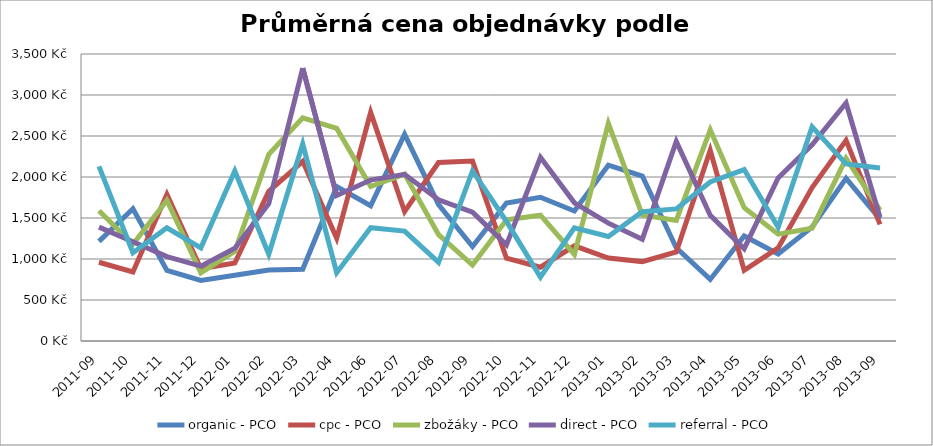
| Category | organic - PCO | cpc - PCO | zbožáky - PCO | direct - PCO | referral - PCO |
|---|---|---|---|---|---|
| 2011-09 | 1214.975 | 960.16 | 1587.581 | 1388.581 | 2128.782 |
| 2011-10 | 1612.362 | 842.084 | 1180.418 | 1211.281 | 1076.297 |
| 2011-11 | 860.968 | 1789.064 | 1716.238 | 1028.898 | 1380.427 |
| 2011-12 | 739.364 | 881.592 | 831.342 | 912.466 | 1136.413 |
| 2012-01 | 801.184 | 950.109 | 1092.736 | 1130.245 | 2073.476 |
| 2012-02 | 864.885 | 1826.188 | 2276.611 | 1674.476 | 1058.148 |
| 2012-03 | 874.575 | 2191.298 | 2721.95 | 3328.465 | 2403.13 |
| 2012-04 | 1881.997 | 1252.425 | 2592.151 | 1773.41 | 832.989 |
| 2012-06 | 1649.143 | 2788.22 | 1883.605 | 1962.323 | 1382.15 |
| 2012-07 | 2519.663 | 1578.686 | 2035.44 | 2032.58 | 1340.403 |
| 2012-08 | 1663.944 | 2176.445 | 1297.43 | 1721.313 | 958.72 |
| 2012-09 | 1151.911 | 2194.482 | 925.633 | 1570.799 | 2074.379 |
| 2012-10 | 1682.851 | 1009.192 | 1477.295 | 1172.825 | 1459.396 |
| 2012-11 | 1752.825 | 899.975 | 1534.211 | 2240.526 | 780.043 |
| 2012-12 | 1585.058 | 1161.178 | 1054.784 | 1685.609 | 1381.185 |
| 2013-01 | 2144.51 | 1011.781 | 2655.198 | 1437.022 | 1275.44 |
| 2013-02 | 2011.656 | 968.198 | 1537.47 | 1241.3 | 1577.586 |
| 2013-03 | 1136.019 | 1085.773 | 1471.336 | 2434.651 | 1610.801 |
| 2013-04 | 750.847 | 2325.874 | 2575.549 | 1534.111 | 1939.302 |
| 2013-05 | 1280.366 | 860.999 | 1625.741 | 1125.62 | 2090.332 |
| 2013-06 | 1062.142 | 1135.371 | 1302.907 | 1988.986 | 1386.402 |
| 2013-07 | 1390.678 | 1871.828 | 1374.661 | 2393.654 | 2612.432 |
| 2013-08 | 1983.019 | 2447.478 | 2227.244 | 2902.724 | 2159.285 |
| 2013-09 | 1486.146 | 1421.928 | 1596.837 | 1508.297 | 2109.894 |